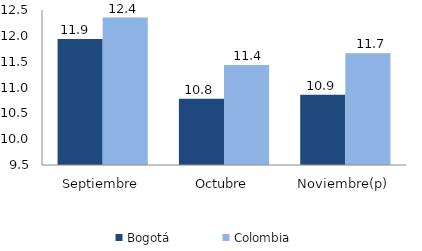
| Category | Bogotá | Colombia |
|---|---|---|
| Septiembre | 11.94 | 12.355 |
| Octubre | 10.782 | 11.437 |
| Noviembre(p) | 10.861 | 11.664 |